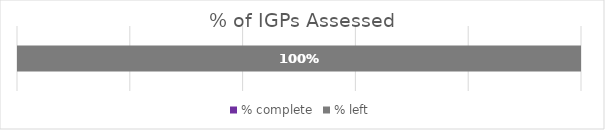
| Category | % complete | % left |
|---|---|---|
| 0 | 0 | 1 |